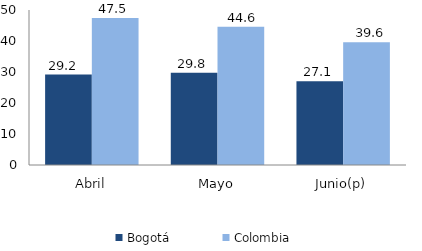
| Category | Bogotá | Colombia |
|---|---|---|
| Abril | 29.171 | 47.452 |
| Mayo | 29.756 | 44.597 |
| Junio(p) | 27.053 | 39.557 |